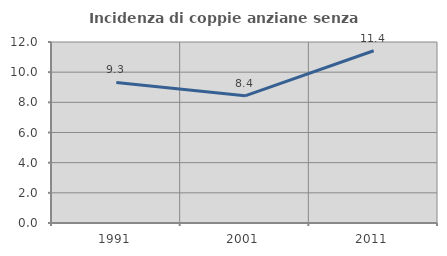
| Category | Incidenza di coppie anziane senza figli  |
|---|---|
| 1991.0 | 9.322 |
| 2001.0 | 8.431 |
| 2011.0 | 11.422 |